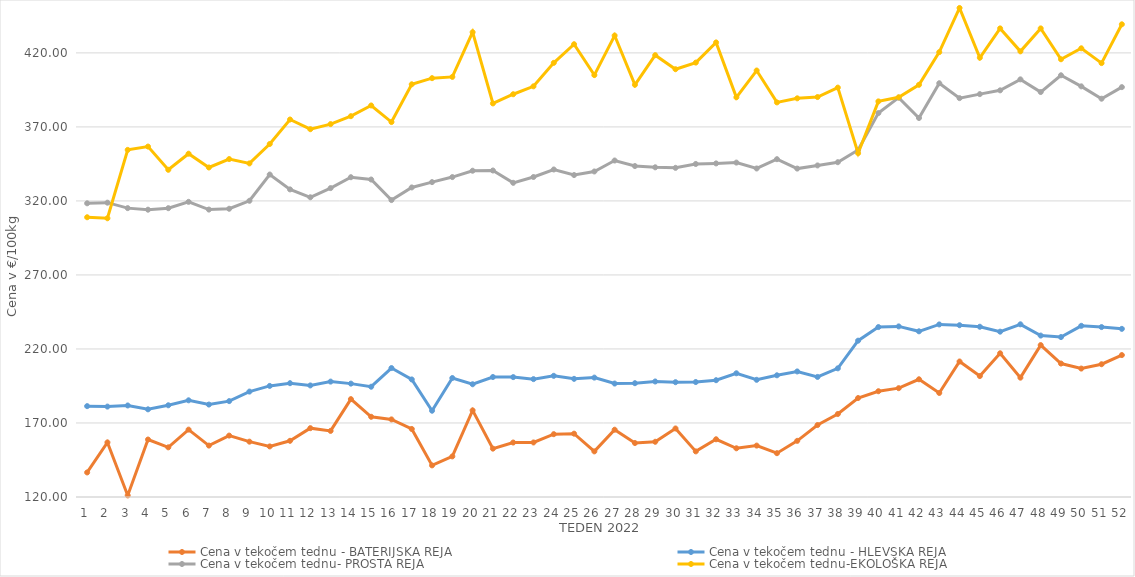
| Category | Cena v tekočem tednu - BATERIJSKA REJA | Cena v tekočem tednu - HLEVSKA REJA | Cena v tekočem tednu- PROSTA REJA | Cena v tekočem tednu-EKOLOŠKA REJA |
|---|---|---|---|---|
| 1.0 | 136.59 | 181.38 | 318.4 | 308.97 |
| 2.0 | 156.88 | 181.07 | 318.82 | 308.28 |
| 3.0 | 121.07 | 181.83 | 315.14 | 354.48 |
| 4.0 | 158.82 | 179.22 | 314.08 | 356.72 |
| 5.0 | 153.55 | 181.96 | 315.1 | 341.03 |
| 6.0 | 165.51 | 185.31 | 319.38 | 351.9 |
| 7.0 | 154.74 | 182.45 | 314.16 | 342.59 |
| 8.0 | 161.48 | 184.77 | 314.71 | 348.28 |
| 9.0 | 157.38 | 191.21 | 320.1 | 345.35 |
| 10.0 | 154.16 | 195.04 | 337.83 | 358.45 |
| 11.0 | 157.96 | 196.88 | 327.79 | 375 |
| 12.0 | 166.49 | 195.36 | 322.46 | 368.45 |
| 13.0 | 164.66 | 197.95 | 328.67 | 371.9 |
| 14.0 | 186.11 | 196.59 | 336.02 | 377.24 |
| 15.0 | 174.18 | 194.49 | 334.46 | 384.48 |
| 16.0 | 172.42 | 207.1 | 320.58 | 373.28 |
| 17.0 | 165.96 | 199.41 | 329.11 | 398.79 |
| 18.0 | 141.36 | 178.29 | 332.71 | 402.93 |
| 19.0 | 147.43 | 200.37 | 336.11 | 403.79 |
| 20.0 | 178.51 | 196.16 | 340.4 | 433.97 |
| 21.0 | 152.67 | 201.05 | 340.55 | 385.86 |
| 22.0 | 156.8 | 200.98 | 332.23 | 392.07 |
| 23.0 | 156.84 | 199.63 | 336.16 | 397.41 |
| 24.0 | 162.44 | 201.86 | 341.24 | 413.28 |
| 25.0 | 162.78 | 199.81 | 337.48 | 425.86 |
| 26.0 | 150.82 | 200.65 | 339.9 | 405 |
| 27.0 | 165.45 | 196.64 | 347.3 | 431.72 |
| 28.0 | 156.46 | 196.88 | 343.56 | 398.45 |
| 29.0 | 157.31 | 198.03 | 342.71 | 418.45 |
| 30.0 | 166.29 | 197.55 | 342.35 | 408.97 |
| 31.0 | 150.81 | 197.66 | 344.97 | 413.45 |
| 32.0 | 158.99 | 198.9 | 345.35 | 427.07 |
| 33.0 | 152.91 | 203.57 | 345.9 | 390 |
| 34.0 | 154.73 | 199.17 | 341.92 | 408.1 |
| 35.0 | 149.6 | 202.21 | 348.2 | 386.55 |
| 36.0 | 157.93 | 204.81 | 341.85 | 389.31 |
| 37.0 | 168.61 | 201.11 | 343.97 | 390.17 |
| 38.0 | 176.07 | 206.91 | 346.16 | 396.55 |
| 39.0 | 186.86 | 225.6 | 354.41 | 352.24 |
| 40.0 | 191.45 | 234.79 | 379.35 | 387.24 |
| 41.0 | 193.52 | 235.24 | 389.75 | 390 |
| 42.0 | 199.51 | 231.92 | 376.02 | 398.45 |
| 43.0 | 190.28 | 236.56 | 399.51 | 420.52 |
| 44.0 | 211.53 | 236.04 | 389.44 | 450.35 |
| 45.0 | 201.69 | 235.01 | 392.15 | 416.72 |
| 46.0 | 217.08 | 231.68 | 394.71 | 436.55 |
| 47.0 | 200.62 | 236.65 | 402.12 | 421.03 |
| 48.0 | 222.61 | 229.05 | 393.56 | 436.55 |
| 49.0 | 210.16 | 228.03 | 404.87 | 415.69 |
| 50.0 | 206.76 | 235.63 | 397.4 | 423.1 |
| 51.0 | 209.69 | 234.79 | 389.05 | 413.1 |
| 52.0 | 215.87 | 233.58 | 396.87 | 439.31 |